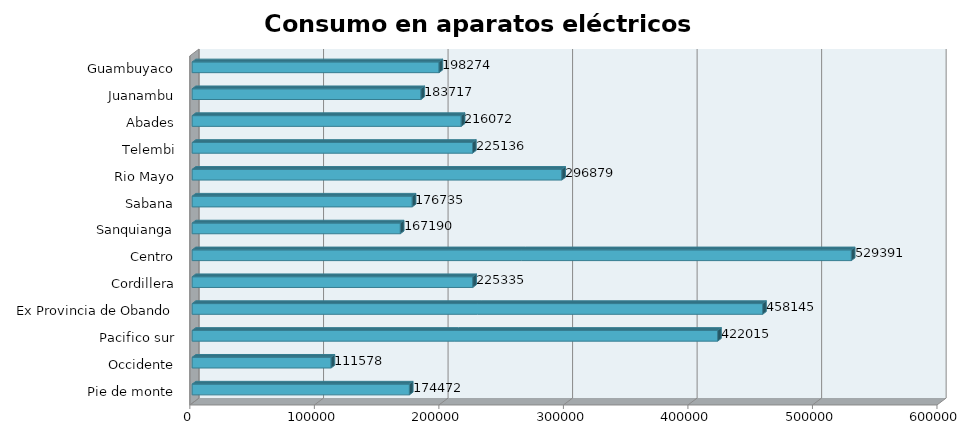
| Category | Series 0 |
|---|---|
| Pie de monte | 174471.998 |
| Occidente | 111578.461 |
| Pacifico sur | 422015.252 |
| Ex Provincia de Obando | 458144.517 |
| Cordillera | 225335.368 |
| Centro | 529390.624 |
| Sanquianga | 167190.091 |
| Sabana | 176734.537 |
| Rio Mayo | 296878.872 |
| Telembi | 225136.175 |
| Abades | 216071.938 |
| Juanambu | 183716.582 |
| Guambuyaco | 198273.876 |